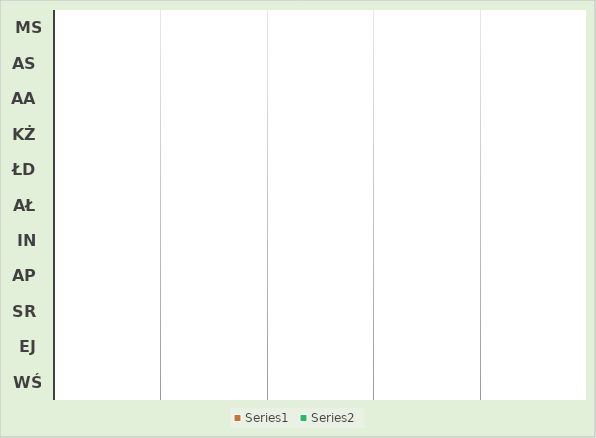
| Category | Series 0 | Series 1 |
|---|---|---|
| MS | 0 | 0 |
| AS | 0 | 0 |
| AA | 0 | 0 |
| KŻ | 0 | 0 |
| ŁD | 0 | 0 |
| AŁ | 0 | 0 |
| IN | 0 | 0 |
| AP | 0 | 0 |
| SR | 0 | 0 |
| EJ | 0 | 0 |
| WŚ | 0 | 0 |